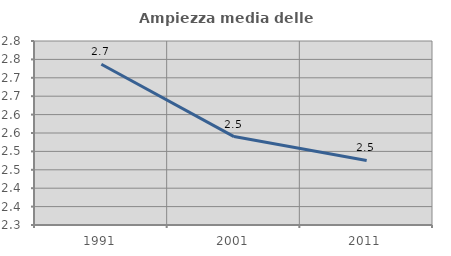
| Category | Ampiezza media delle famiglie |
|---|---|
| 1991.0 | 2.737 |
| 2001.0 | 2.54 |
| 2011.0 | 2.475 |